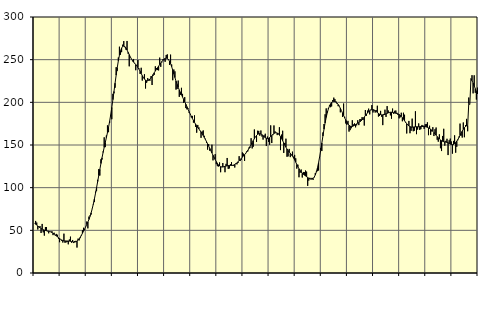
| Category | Piggar | Series 1 |
|---|---|---|
| nan | 58.2 | 58.12 |
| 87.0 | 61 | 57.19 |
| 87.0 | 59.1 | 56.21 |
| 87.0 | 51 | 55.12 |
| 87.0 | 53.6 | 54.06 |
| 87.0 | 55 | 53.06 |
| 87.0 | 46.9 | 52.12 |
| 87.0 | 57.5 | 51.34 |
| 87.0 | 47.6 | 50.7 |
| 87.0 | 43.8 | 50.21 |
| 87.0 | 53.8 | 49.83 |
| 87.0 | 53.8 | 49.52 |
| nan | 48.9 | 49.25 |
| 88.0 | 46.5 | 48.95 |
| 88.0 | 48.5 | 48.56 |
| 88.0 | 48.3 | 48.08 |
| 88.0 | 48.9 | 47.43 |
| 88.0 | 44.4 | 46.61 |
| 88.0 | 47.2 | 45.64 |
| 88.0 | 44 | 44.59 |
| 88.0 | 45.8 | 43.5 |
| 88.0 | 44.8 | 42.44 |
| 88.0 | 40.2 | 41.39 |
| 88.0 | 36.1 | 40.37 |
| nan | 39.6 | 39.43 |
| 89.0 | 37.7 | 38.68 |
| 89.0 | 35.7 | 38.12 |
| 89.0 | 46.1 | 37.74 |
| 89.0 | 35.4 | 37.56 |
| 89.0 | 35.9 | 37.51 |
| 89.0 | 36.6 | 37.52 |
| 89.0 | 33.6 | 37.49 |
| 89.0 | 39.3 | 37.39 |
| 89.0 | 42.6 | 37.17 |
| 89.0 | 35.5 | 36.84 |
| 89.0 | 38.7 | 36.53 |
| nan | 35.1 | 36.33 |
| 90.0 | 37.5 | 36.32 |
| 90.0 | 37.7 | 36.64 |
| 90.0 | 29.8 | 37.32 |
| 90.0 | 40.3 | 38.4 |
| 90.0 | 38.2 | 39.92 |
| 90.0 | 40.8 | 41.83 |
| 90.0 | 43.5 | 44.06 |
| 90.0 | 50.1 | 46.5 |
| 90.0 | 53 | 49.01 |
| 90.0 | 50.2 | 51.57 |
| 90.0 | 53.9 | 54.18 |
| nan | 60.3 | 56.82 |
| 91.0 | 52.3 | 59.65 |
| 91.0 | 66.1 | 62.78 |
| 91.0 | 67.5 | 66.37 |
| 91.0 | 68.5 | 70.55 |
| 91.0 | 75.1 | 75.33 |
| 91.0 | 80.3 | 80.76 |
| 91.0 | 83.1 | 86.79 |
| 91.0 | 95.3 | 93.26 |
| 91.0 | 95.9 | 100.07 |
| 91.0 | 109.2 | 107.11 |
| 91.0 | 121.7 | 114.24 |
| nan | 114.2 | 121.38 |
| 92.0 | 133.3 | 128.33 |
| 92.0 | 133 | 134.99 |
| 92.0 | 142.4 | 141.28 |
| 92.0 | 159 | 147.22 |
| 92.0 | 147.5 | 152.95 |
| 92.0 | 161.1 | 158.65 |
| 92.0 | 173 | 164.51 |
| 92.0 | 165 | 170.81 |
| 92.0 | 175.9 | 177.78 |
| 92.0 | 184.5 | 185.54 |
| 92.0 | 180.2 | 194.03 |
| nan | 210 | 203.16 |
| 93.0 | 210.6 | 212.76 |
| 93.0 | 217.1 | 222.44 |
| 93.0 | 241.2 | 231.85 |
| 93.0 | 237 | 240.68 |
| 93.0 | 252.5 | 248.56 |
| 93.0 | 265.2 | 255.17 |
| 93.0 | 255.8 | 260.23 |
| 93.0 | 258.8 | 263.64 |
| 93.0 | 267.6 | 265.48 |
| 93.0 | 271.8 | 265.92 |
| 93.0 | 264.5 | 265.22 |
| nan | 261.7 | 263.59 |
| 94.0 | 271.9 | 261.28 |
| 94.0 | 257 | 258.65 |
| 94.0 | 242.2 | 255.91 |
| 94.0 | 253.2 | 253.29 |
| 94.0 | 250.7 | 250.95 |
| 94.0 | 248.2 | 248.89 |
| 94.0 | 250.8 | 247.15 |
| 94.0 | 246.2 | 245.69 |
| 94.0 | 237.6 | 244.29 |
| 94.0 | 242.9 | 242.73 |
| 94.0 | 249.6 | 240.9 |
| nan | 239.7 | 238.76 |
| 95.0 | 233.3 | 236.34 |
| 95.0 | 240.5 | 233.76 |
| 95.0 | 225.5 | 231.29 |
| 95.0 | 228.7 | 229.09 |
| 95.0 | 232.9 | 227.26 |
| 95.0 | 216.2 | 225.96 |
| 95.0 | 222.9 | 225.31 |
| 95.0 | 228.4 | 225.31 |
| 95.0 | 226.7 | 225.97 |
| 95.0 | 225.2 | 227.2 |
| 95.0 | 230.6 | 228.8 |
| nan | 220.3 | 230.65 |
| 96.0 | 231.1 | 232.66 |
| 96.0 | 232.2 | 234.71 |
| 96.0 | 242.2 | 236.71 |
| 96.0 | 240.2 | 238.65 |
| 96.0 | 237.8 | 240.56 |
| 96.0 | 237.4 | 242.41 |
| 96.0 | 252.4 | 244.24 |
| 96.0 | 241.6 | 246.05 |
| 96.0 | 246.8 | 247.78 |
| 96.0 | 250.5 | 249.32 |
| 96.0 | 249.3 | 250.59 |
| nan | 247.5 | 251.48 |
| 97.0 | 255.5 | 251.8 |
| 97.0 | 256.2 | 251.43 |
| 97.0 | 249.7 | 250.28 |
| 97.0 | 243.8 | 248.23 |
| 97.0 | 255.9 | 245.34 |
| 97.0 | 244.3 | 241.78 |
| 97.0 | 225.9 | 237.7 |
| 97.0 | 238.5 | 233.36 |
| 97.0 | 236.3 | 229.04 |
| 97.0 | 214.9 | 224.9 |
| 97.0 | 215.6 | 221.08 |
| nan | 225.5 | 217.63 |
| 98.0 | 206.4 | 214.53 |
| 98.0 | 208.8 | 211.65 |
| 98.0 | 217 | 208.92 |
| 98.0 | 209.9 | 206.22 |
| 98.0 | 199.4 | 203.47 |
| 98.0 | 206.1 | 200.65 |
| 98.0 | 193.3 | 197.81 |
| 98.0 | 191.8 | 194.93 |
| 98.0 | 193.1 | 191.99 |
| 98.0 | 187.8 | 189.12 |
| 98.0 | 186.2 | 186.4 |
| nan | 182.5 | 183.77 |
| 99.0 | 184.1 | 181.23 |
| 99.0 | 176.2 | 178.83 |
| 99.0 | 184.7 | 176.54 |
| 99.0 | 171.2 | 174.39 |
| 99.0 | 164.4 | 172.4 |
| 99.0 | 173.5 | 170.55 |
| 99.0 | 170.7 | 168.77 |
| 99.0 | 167.3 | 166.97 |
| 99.0 | 158.4 | 165.12 |
| 99.0 | 165.9 | 163.17 |
| 99.0 | 167.1 | 161.08 |
| nan | 160.8 | 158.84 |
| 0.0 | 157.3 | 156.47 |
| 0.0 | 152.6 | 153.98 |
| 0.0 | 144.6 | 151.37 |
| 0.0 | 151.1 | 148.71 |
| 0.0 | 143.3 | 146.06 |
| 0.0 | 143.7 | 143.38 |
| 0.0 | 150.4 | 140.67 |
| 0.0 | 132 | 138.01 |
| 0.0 | 135 | 135.43 |
| 0.0 | 139.3 | 132.94 |
| 0.0 | 127.5 | 130.56 |
| nan | 125.2 | 128.44 |
| 1.0 | 124.8 | 126.69 |
| 1.0 | 129.5 | 125.39 |
| 1.0 | 118.1 | 124.57 |
| 1.0 | 124.5 | 124.21 |
| 1.0 | 128.9 | 124.23 |
| 1.0 | 124.3 | 124.51 |
| 1.0 | 118.1 | 124.91 |
| 1.0 | 127.9 | 125.32 |
| 1.0 | 134.8 | 125.66 |
| 1.0 | 122 | 125.87 |
| 1.0 | 122.5 | 125.97 |
| nan | 127.5 | 126.02 |
| 2.0 | 129.9 | 126.06 |
| 2.0 | 125.7 | 126.22 |
| 2.0 | 125.7 | 126.57 |
| 2.0 | 123.6 | 127.18 |
| 2.0 | 128.6 | 128.02 |
| 2.0 | 127.3 | 129.06 |
| 2.0 | 129 | 130.28 |
| 2.0 | 136.9 | 131.59 |
| 2.0 | 131.2 | 132.93 |
| 2.0 | 132.7 | 134.33 |
| 2.0 | 141.3 | 135.76 |
| nan | 139.9 | 137.19 |
| 3.0 | 131.3 | 138.66 |
| 3.0 | 139.7 | 140.22 |
| 3.0 | 142.6 | 141.91 |
| 3.0 | 142.6 | 143.78 |
| 3.0 | 147 | 145.85 |
| 3.0 | 146.7 | 148.07 |
| 3.0 | 158 | 150.43 |
| 3.0 | 146 | 152.86 |
| 3.0 | 148 | 155.23 |
| 3.0 | 168.2 | 157.48 |
| 3.0 | 159.4 | 159.49 |
| nan | 153.6 | 161.15 |
| 4.0 | 166.7 | 162.41 |
| 4.0 | 166.5 | 163.14 |
| 4.0 | 160.9 | 163.31 |
| 4.0 | 167 | 162.95 |
| 4.0 | 159.9 | 162.1 |
| 4.0 | 156.3 | 160.93 |
| 4.0 | 161.2 | 159.66 |
| 4.0 | 163.2 | 158.55 |
| 4.0 | 148.8 | 157.83 |
| 4.0 | 159.9 | 157.55 |
| 4.0 | 153.5 | 157.81 |
| nan | 150.3 | 158.62 |
| 5.0 | 173 | 159.78 |
| 5.0 | 152.3 | 161.12 |
| 5.0 | 161.5 | 162.45 |
| 5.0 | 172.9 | 163.51 |
| 5.0 | 166 | 164.18 |
| 5.0 | 164.5 | 164.38 |
| 5.0 | 161.6 | 164.04 |
| 5.0 | 163.8 | 163.13 |
| 5.0 | 170.8 | 161.69 |
| 5.0 | 144 | 159.81 |
| 5.0 | 162.2 | 157.55 |
| nan | 166.7 | 155.05 |
| 6.0 | 140.7 | 152.42 |
| 6.0 | 152.4 | 149.82 |
| 6.0 | 157.4 | 147.43 |
| 6.0 | 136.2 | 145.31 |
| 6.0 | 136.7 | 143.46 |
| 6.0 | 145.4 | 141.83 |
| 6.0 | 135.8 | 140.32 |
| 6.0 | 138 | 138.75 |
| 6.0 | 142.2 | 136.97 |
| 6.0 | 136.3 | 134.89 |
| 6.0 | 138.4 | 132.51 |
| nan | 134.4 | 129.88 |
| 7.0 | 122.3 | 127.17 |
| 7.0 | 126.9 | 124.57 |
| 7.0 | 112.2 | 122.13 |
| 7.0 | 117.4 | 119.98 |
| 7.0 | 121.3 | 118.23 |
| 7.0 | 111.9 | 116.83 |
| 7.0 | 118.4 | 115.68 |
| 7.0 | 118.2 | 114.68 |
| 7.0 | 120.1 | 113.76 |
| 7.0 | 118.8 | 112.85 |
| 7.0 | 102.1 | 111.95 |
| nan | 108.3 | 111.07 |
| 8.0 | 111.6 | 110.37 |
| 8.0 | 110.6 | 110.01 |
| 8.0 | 111.5 | 110.11 |
| 8.0 | 109.2 | 110.85 |
| 8.0 | 112.1 | 112.4 |
| 8.0 | 117.1 | 114.94 |
| 8.0 | 119.4 | 118.62 |
| 8.0 | 119.3 | 123.43 |
| 8.0 | 120.1 | 129.35 |
| 8.0 | 136 | 136.29 |
| 8.0 | 146.5 | 144.04 |
| nan | 142.9 | 152.28 |
| 9.0 | 164.7 | 160.57 |
| 9.0 | 174.6 | 168.53 |
| 9.0 | 186 | 175.85 |
| 9.0 | 192.9 | 182.33 |
| 9.0 | 189.6 | 187.8 |
| 9.0 | 193.4 | 192.23 |
| 9.0 | 196.4 | 195.66 |
| 9.0 | 194.3 | 198.21 |
| 9.0 | 195.2 | 199.92 |
| 9.0 | 202.7 | 200.88 |
| 9.0 | 205.5 | 201.19 |
| nan | 203.8 | 200.97 |
| 10.0 | 201.1 | 200.26 |
| 10.0 | 198.2 | 199.06 |
| 10.0 | 195.5 | 197.42 |
| 10.0 | 196 | 195.41 |
| 10.0 | 188.3 | 193.06 |
| 10.0 | 190.4 | 190.39 |
| 10.0 | 182.9 | 187.51 |
| 10.0 | 198.6 | 184.57 |
| 10.0 | 183 | 181.73 |
| 10.0 | 175.2 | 179.07 |
| 10.0 | 173.7 | 176.68 |
| nan | 178.3 | 174.67 |
| 11.0 | 165.7 | 173.13 |
| 11.0 | 167.4 | 172.11 |
| 11.0 | 169.6 | 171.65 |
| 11.0 | 179 | 171.73 |
| 11.0 | 174.1 | 172.23 |
| 11.0 | 175.3 | 173.02 |
| 11.0 | 170.7 | 173.9 |
| 11.0 | 173 | 174.75 |
| 11.0 | 179 | 175.53 |
| 11.0 | 173.3 | 176.34 |
| 11.0 | 180.4 | 177.24 |
| nan | 180.4 | 178.3 |
| 12.0 | 182.7 | 179.56 |
| 12.0 | 179.6 | 181.09 |
| 12.0 | 172.8 | 182.78 |
| 12.0 | 191 | 184.48 |
| 12.0 | 184.3 | 186.12 |
| 12.0 | 190.3 | 187.66 |
| 12.0 | 192.6 | 189.01 |
| 12.0 | 185.9 | 190.11 |
| 12.0 | 191.4 | 190.93 |
| 12.0 | 196.8 | 191.39 |
| 12.0 | 188.1 | 191.44 |
| nan | 190.2 | 191.07 |
| 13.0 | 188 | 190.31 |
| 13.0 | 190.9 | 189.27 |
| 13.0 | 196 | 188.14 |
| 13.0 | 183.3 | 187.07 |
| 13.0 | 184 | 186.19 |
| 13.0 | 190 | 185.6 |
| 13.0 | 183.1 | 185.3 |
| 13.0 | 173.3 | 185.31 |
| 13.0 | 186.4 | 185.56 |
| 13.0 | 191.4 | 185.97 |
| 13.0 | 182.9 | 186.5 |
| nan | 195.6 | 187.1 |
| 14.0 | 190.5 | 187.7 |
| 14.0 | 187.8 | 188.15 |
| 14.0 | 184.7 | 188.41 |
| 14.0 | 180.8 | 188.42 |
| 14.0 | 192.7 | 188.23 |
| 14.0 | 186.6 | 187.88 |
| 14.0 | 190.1 | 187.52 |
| 14.0 | 190.4 | 187.21 |
| 14.0 | 187.7 | 186.88 |
| 14.0 | 185.2 | 186.43 |
| 14.0 | 181.2 | 185.78 |
| nan | 182.4 | 184.82 |
| 15.0 | 187.8 | 183.53 |
| 15.0 | 177.8 | 182.01 |
| 15.0 | 187.8 | 180.25 |
| 15.0 | 185.5 | 178.41 |
| 15.0 | 176.1 | 176.61 |
| 15.0 | 163.5 | 174.92 |
| 15.0 | 173.5 | 173.46 |
| 15.0 | 178.2 | 172.31 |
| 15.0 | 163.8 | 171.51 |
| 15.0 | 166.6 | 171.06 |
| 15.0 | 180.9 | 170.93 |
| nan | 166.1 | 171.02 |
| 16.0 | 166.7 | 171.19 |
| 16.0 | 189.5 | 171.3 |
| 16.0 | 162.7 | 171.36 |
| 16.0 | 168.1 | 171.35 |
| 16.0 | 175.3 | 171.34 |
| 16.0 | 167.7 | 171.43 |
| 16.0 | 168.6 | 171.57 |
| 16.0 | 173.5 | 171.7 |
| 16.0 | 172.8 | 171.77 |
| 16.0 | 168.9 | 171.73 |
| 16.0 | 174.3 | 171.53 |
| nan | 174.6 | 171.18 |
| 17.0 | 176.6 | 170.68 |
| 17.0 | 161.5 | 170.04 |
| 17.0 | 172.6 | 169.3 |
| 17.0 | 161.9 | 168.48 |
| 17.0 | 165.9 | 167.42 |
| 17.0 | 170.9 | 166.12 |
| 17.0 | 160.5 | 164.66 |
| 17.0 | 168.5 | 163.06 |
| 17.0 | 170.5 | 161.46 |
| 17.0 | 156.1 | 159.92 |
| 17.0 | 153.9 | 158.46 |
| nan | 162.5 | 157.09 |
| 18.0 | 146.2 | 155.93 |
| 18.0 | 142.9 | 155.03 |
| 18.0 | 160.6 | 154.35 |
| 18.0 | 169 | 153.89 |
| 18.0 | 149.2 | 153.63 |
| 18.0 | 154.9 | 153.41 |
| 18.0 | 157.3 | 153.1 |
| 18.0 | 138.2 | 152.58 |
| 18.0 | 155.6 | 151.86 |
| 18.0 | 157.5 | 151.13 |
| 18.0 | 154.1 | 150.57 |
| nan | 139.9 | 150.4 |
| 19.0 | 154.8 | 150.73 |
| 19.0 | 161.3 | 151.58 |
| 19.0 | 141 | 152.91 |
| 19.0 | 147.9 | 154.55 |
| 19.0 | 155.6 | 156.5 |
| 19.0 | 159.9 | 158.74 |
| 19.0 | 175.1 | 161.16 |
| 19.0 | 161 | 163.7 |
| 19.0 | 158.7 | 166.19 |
| 19.0 | 176.4 | 168.41 |
| 19.0 | 159.1 | 170.28 |
| nan | 173.2 | 171.69 |
| 20.0 | 180.6 | 172.52 |
| 20.0 | 166.1 | 172.68 |
| 20.0 | 205.6 | 198.55 |
| 20.0 | 197.4 | 197.43 |
| 20.0 | 227.5 | 227.76 |
| 20.0 | 231.8 | 225.39 |
| 20.0 | 210.5 | 222.51 |
| 20.0 | 231.7 | 219.3 |
| 20.0 | 211.2 | 216.02 |
| 20.0 | 203.3 | 212.81 |
| 20.0 | 217.2 | 209.77 |